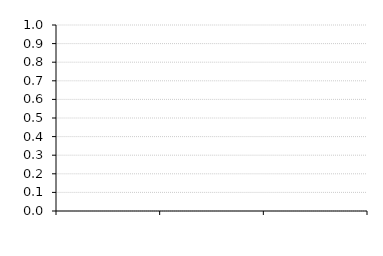
| Category | AR Turnover Ratio |
|---|---|
| 0 | 0 |
| 1 | 0 |
| 2 | 0 |